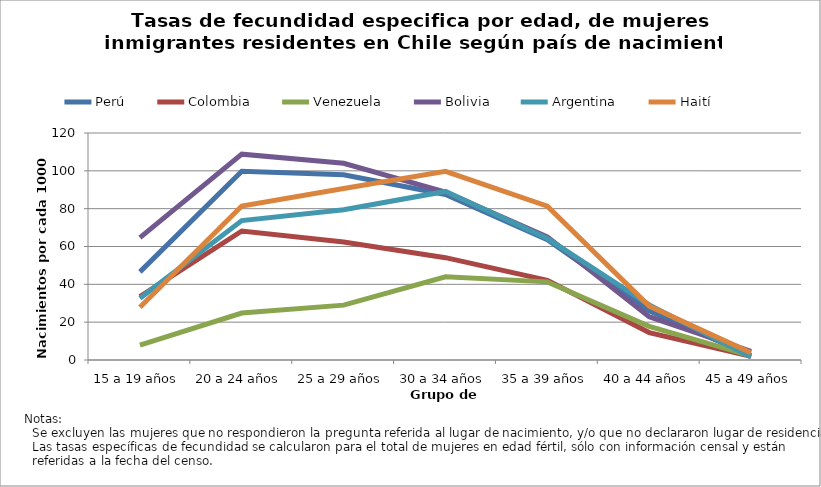
| Category | Perú | Colombia | Venezuela | Bolivia | Argentina | Haití |
|---|---|---|---|---|---|---|
| 15 a 19 años | 46.6 | 33.5 | 7.9 | 64.7 | 32.7 | 27.9 |
| 20 a 24 años | 99.8 | 68.2 | 24.8 | 108.8 | 73.7 | 81.4 |
| 25 a 29 años | 97.9 | 62.4 | 29 | 104 | 79.4 | 90.7 |
| 30 a 34 años | 87.5 | 54.1 | 44 | 88.8 | 89.1 | 99.7 |
| 35 a 39 años | 63.6 | 42.1 | 41.3 | 65.1 | 64.2 | 81.3 |
| 40 a 44 años | 26 | 14.5 | 17.8 | 22.9 | 29.1 | 28.5 |
| 45 a 49 años | 2.4 | 2 | 2.2 | 4.6 | 1.6 | 3.8 |